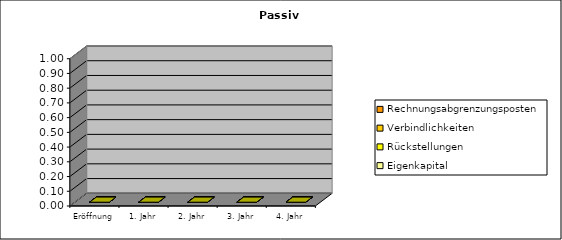
| Category | Eigenkapital  | Rückstellungen | Verbindlichkeiten | Rechnungsabgrenzungsposten |
|---|---|---|---|---|
| Eröffnung | 0 | 0 | 0 | 0 |
| 1. Jahr | 0 | 0 | 0 | 0 |
| 2. Jahr | 0 | 0 | 0 | 0 |
| 3. Jahr | 0 | 0 | 0 | 0 |
| 4. Jahr | 0 | 0 | 0 | 0 |